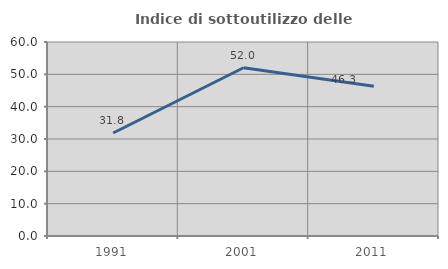
| Category | Indice di sottoutilizzo delle abitazioni  |
|---|---|
| 1991.0 | 31.847 |
| 2001.0 | 52.041 |
| 2011.0 | 46.284 |